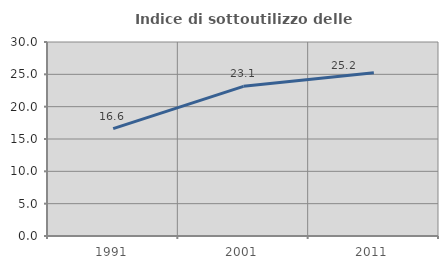
| Category | Indice di sottoutilizzo delle abitazioni  |
|---|---|
| 1991.0 | 16.613 |
| 2001.0 | 23.149 |
| 2011.0 | 25.247 |